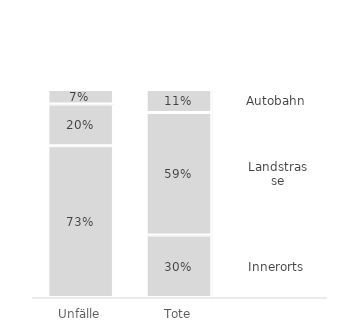
| Category | Innerorts | Landstrasse | Autobahn |
|---|---|---|---|
| Unfälle | 0.73 | 0.2 | 0.07 |
| Tote | 0.3 | 0.59 | 0.11 |